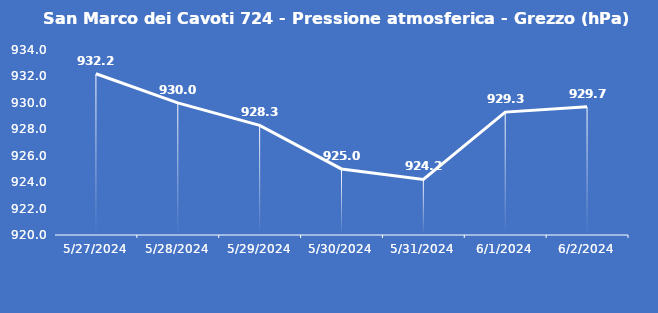
| Category | San Marco dei Cavoti 724 - Pressione atmosferica - Grezzo (hPa) |
|---|---|
| 5/27/24 | 932.2 |
| 5/28/24 | 930 |
| 5/29/24 | 928.3 |
| 5/30/24 | 925 |
| 5/31/24 | 924.2 |
| 6/1/24 | 929.3 |
| 6/2/24 | 929.7 |